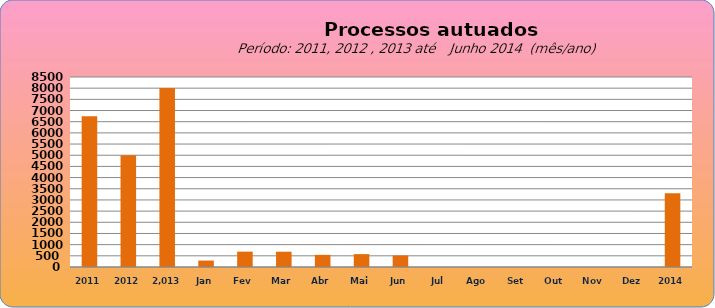
| Category | 6749 4998  8.003   288  688 684 543 577 516 0 0 0 0 0 0 |
|---|---|
| 2011 | 6749 |
| 2012 | 4998 |
|  2.013  | 8003 |
| Jan | 288 |
| Fev | 688 |
| Mar | 684 |
| Abr | 543 |
| Mai | 577 |
| Jun | 516 |
| Jul | 0 |
| Ago | 0 |
| Set | 0 |
| Out | 0 |
| Nov | 0 |
| Dez | 0 |
| 2014 | 3295 |